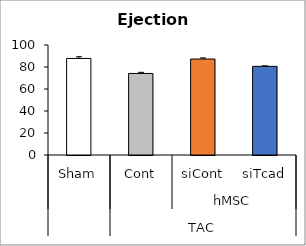
| Category | Series 0 |
|---|---|
| 0 | 87.76 |
| 1 | 74.13 |
| 2 | 87.253 |
| 3 | 80.568 |